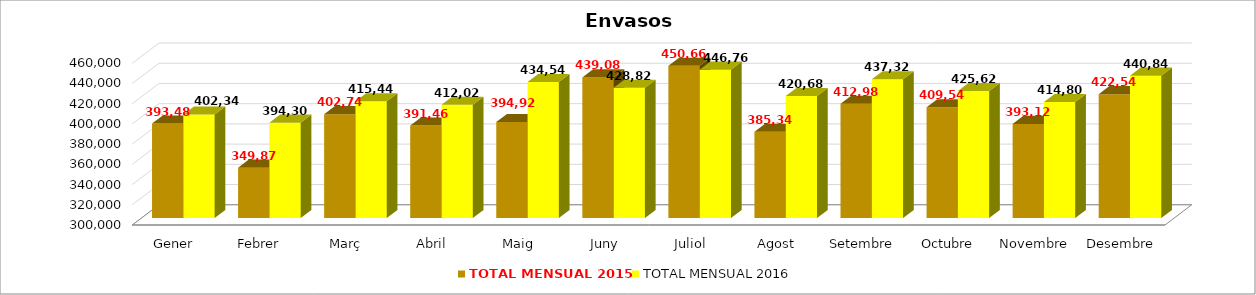
| Category | TOTAL MENSUAL 2015 | TOTAL MENSUAL 2016 |
|---|---|---|
| Gener | 393480 | 402340.02 |
| Febrer | 349869.96 | 394299.99 |
| Març | 402739.99 | 415440.02 |
| Abril | 391459.99 | 412020.23 |
| Maig | 394919.99 | 434539.55 |
| Juny | 439080 | 428819.99 |
| Juliol | 450660.01 | 446760 |
| Agost | 385340.04 | 420679.99 |
| Setembre | 412980 | 437320.01 |
| Octubre | 409541.14 | 425620.01 |
| Novembre | 393119.89 | 414800.37 |
| Desembre | 422539.98 | 440840.01 |